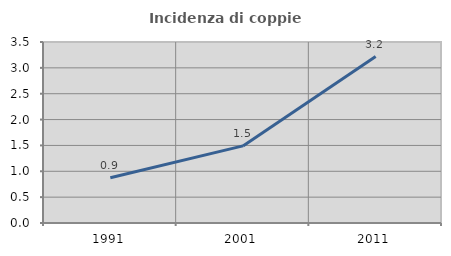
| Category | Incidenza di coppie miste |
|---|---|
| 1991.0 | 0.875 |
| 2001.0 | 1.491 |
| 2011.0 | 3.218 |